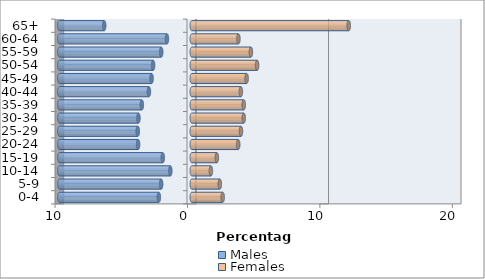
| Category | Males | Females |
|---|---|---|
| 0-4 | -2.489 | 2.332 |
| 5-9 | -2.313 | 2.115 |
| 10-14 | -1.621 | 1.442 |
| 15-19 | -2.19 | 1.892 |
| 20-24 | -4.055 | 3.508 |
| 25-29 | -4.078 | 3.715 |
| 30-34 | -4.028 | 3.921 |
| 35-39 | -3.772 | 3.921 |
| 40-44 | -3.238 | 3.706 |
| 45-49 | -3.036 | 4.14 |
| 50-54 | -2.919 | 4.932 |
| 55-59 | -2.309 | 4.465 |
| 60-64 | -1.878 | 3.52 |
| 65+ | -6.613 | 11.852 |